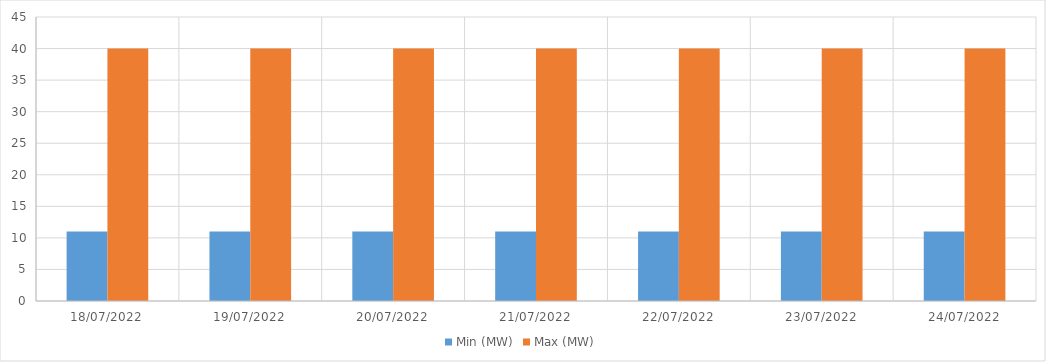
| Category | Min (MW) | Max (MW) |
|---|---|---|
| 18/07/2022 | 11 | 40 |
| 19/07/2022 | 11 | 40 |
| 20/07/2022 | 11 | 40 |
| 21/07/2022 | 11 | 40 |
| 22/07/2022 | 11 | 40 |
| 23/07/2022 | 11 | 40 |
| 24/07/2022 | 11 | 40 |